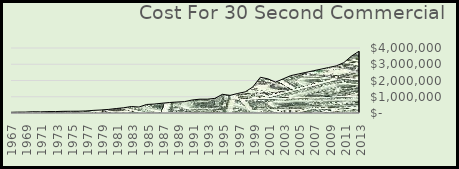
| Category | Cost For 30 Sec Ad |
|---|---|
| 2013.0 | 3800000 |
| 2012.0 | 3500000 |
| 2011.0 | 3100000 |
| 2010.0 | 2900000 |
| 2009.0 | 2800000 |
| 2008.0 | 2700000 |
| 2007.0 | 2600000 |
| 2006.0 | 2500000 |
| 2005.0 | 2400000 |
| 2004.0 | 2300000 |
| 2003.0 | 2100000 |
| 2002.0 | 1900000 |
| 2001.0 | 2100000 |
| 2000.0 | 2200000 |
| 1999.0 | 1600000 |
| 1998.0 | 1300000 |
| 1997.0 | 1200000 |
| 1996.0 | 1085000 |
| 1995.0 | 1150000 |
| 1994.0 | 900000 |
| 1993.0 | 850000 |
| 1992.0 | 850000 |
| 1991.0 | 800000 |
| 1990.0 | 700000 |
| 1989.0 | 675000 |
| 1988.0 | 645000 |
| 1987.0 | 600000 |
| 1986.0 | 550000 |
| 1985.0 | 525000 |
| 1984.0 | 368000 |
| 1983.0 | 400000 |
| 1982.0 | 324000 |
| 1981.0 | 275000 |
| 1980.0 | 222000 |
| 1979.0 | 185000 |
| 1978.0 | 162000 |
| 1977.0 | 125000 |
| 1976.0 | 110000 |
| 1975.0 | 107000 |
| 1974.0 | 103000 |
| 1973.0 | 88000 |
| 1972.0 | 86000 |
| 1971.0 | 72000 |
| 1970.0 | 78000 |
| 1969.0 | 55000 |
| 1968.0 | 54000 |
| 1967.0 | 42000 |